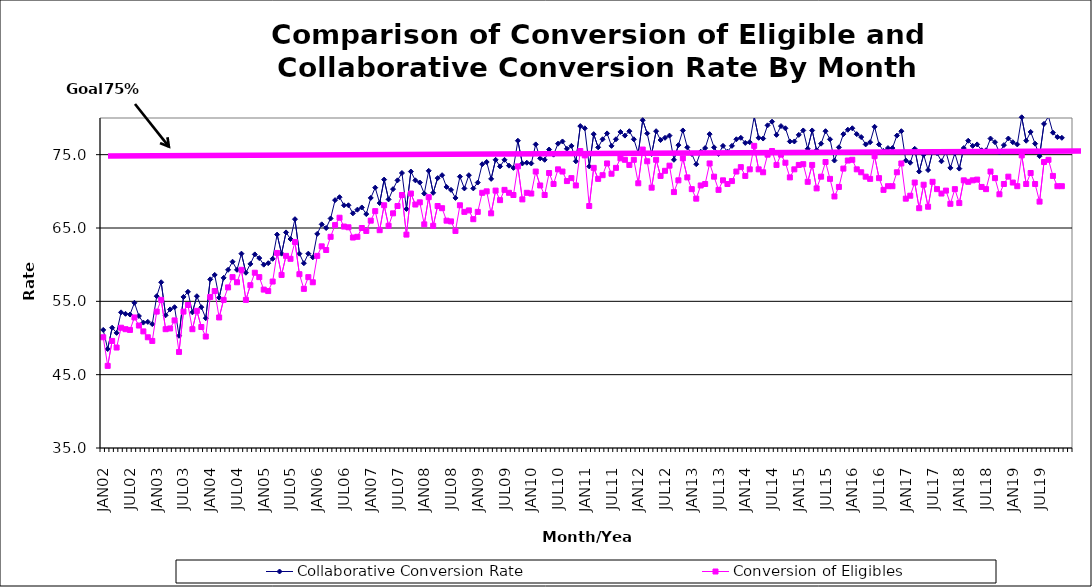
| Category | Collaborative Conversion Rate | Conversion of Eligibles |
|---|---|---|
| JAN02 | 51.1 | 50.1 |
| FEB02 | 48.5 | 46.2 |
| MAR02 | 51.4 | 49.6 |
| APR02 | 50.7 | 48.7 |
| MAY02 | 53.5 | 51.4 |
| JUN02 | 53.3 | 51.2 |
| JUL02 | 53.2 | 51.1 |
| AUG02 | 54.8 | 52.8 |
| SEP02 | 53 | 51.7 |
| OCT02 | 52.1 | 50.9 |
| NOV02 | 52.2 | 50.1 |
| DEC02 | 51.9 | 49.6 |
| JAN03 | 55.7 | 53.6 |
| FEB03 | 57.6 | 55.2 |
| MAR03 | 53.1 | 51.2 |
| APR03 | 53.9 | 51.3 |
| MAY03 | 54.2 | 52.4 |
| JUN03 | 50.3 | 48.1 |
| JUL03 | 55.6 | 53.6 |
| AUG03 | 56.3 | 54.5 |
| SEP03 | 53.5 | 51.2 |
| OCT03 | 55.7 | 53.7 |
| NOV03 | 54.2 | 51.5 |
| DEC03 | 52.7 | 50.2 |
| JAN04 | 58 | 55.6 |
| FEB04 | 58.6 | 56.4 |
| MAR04 | 55.5 | 52.8 |
| APR04 | 58.2 | 55.2 |
| MAY04 | 59.3 | 56.9 |
| JUN04 | 60.4 | 58.3 |
| JUL04 | 59.3 | 57.6 |
| AUG04 | 61.5 | 59.3 |
| SEP04 | 58.9 | 55.2 |
| OCT04 | 60.1 | 57.2 |
| NOV04 | 61.4 | 58.9 |
| DEC04 | 60.9 | 58.3 |
| JAN05 | 60 | 56.6 |
| FEB05 | 60.2 | 56.4 |
| MAR05 | 60.8 | 57.7 |
| APR05 | 64.1 | 61.6 |
| MAY05 | 61.5 | 58.6 |
| JUN05 | 64.4 | 61.2 |
| JUL05 | 63.5 | 60.8 |
| AUG05 | 66.2 | 63.1 |
| SEP05 | 61.5 | 58.7 |
| OCT05 | 60.2 | 56.7 |
| NOV05 | 61.5 | 58.3 |
| DEC05 | 61 | 57.6 |
| JAN06 | 64.2 | 61.2 |
| FEB06 | 65.5 | 62.5 |
| MAR06 | 65 | 62 |
| APR06 | 66.3 | 63.8 |
| MAY06 | 68.8 | 65.4 |
| JUN06 | 69.2 | 66.4 |
| JUL06 | 68.1 | 65.2 |
| AUG06 | 68.1 | 65.1 |
| SEP06 | 67 | 63.7 |
| OCT06 | 67.5 | 63.8 |
| NOV06 | 67.8 | 65 |
| DEC06 | 66.9 | 64.6 |
| JAN07 | 69.1 | 66 |
| FEB07 | 70.5 | 67.3 |
| MAR07 | 68.4 | 64.7 |
| APR07 | 71.6 | 68.1 |
| MAY07 | 68.9 | 65.3 |
| JUN07 | 70.3 | 67 |
| JUL07 | 71.5 | 68 |
| AUG07 | 72.5 | 69.5 |
| SEP07 | 67.6 | 64.1 |
| OCT07 | 72.7 | 69.7 |
| NOV07 | 71.5 | 68.2 |
| DEC07 | 71.2 | 68.5 |
| JAN08 | 69.7 | 65.5 |
| FEB08 | 72.8 | 69.2 |
| MAR08 | 69.8 | 65.3 |
| APR08 | 71.8 | 68 |
| MAY08 | 72.2 | 67.7 |
| JUN08 | 70.6 | 66 |
| JUL08 | 70.2 | 65.9 |
| AUG08 | 69.1 | 64.6 |
| SEP08 | 72 | 68.1 |
| OCT08 | 70.4 | 67.2 |
| NOV08 | 72.2 | 67.4 |
| DEC08 | 70.4 | 66.2 |
| JAN09 | 71.2 | 67.2 |
| FEB09 | 73.7 | 69.8 |
| MAR09 | 74 | 70 |
| APR09 | 71.7 | 67 |
| MAY09 | 74.3 | 70.1 |
| JUN09 | 73.4 | 68.8 |
| JUL09 | 74.3 | 70.2 |
| AUG09 | 73.5 | 69.8 |
| SEP09 | 73.2 | 69.5 |
| OCT09 | 76.9 | 73.4 |
| NOV09 | 73.8 | 68.9 |
| DEC09 | 73.9 | 69.8 |
| JAN10 | 73.8 | 69.7 |
| FEB10 | 76.4 | 72.7 |
| MAR10 | 74.5 | 70.8 |
| APR10 | 74.3 | 69.5 |
| MAY10 | 75.7 | 72.5 |
| JUN10 | 75 | 71 |
| JUL10 | 76.5 | 73 |
| AUG10 | 76.8 | 72.7 |
| SEP10 | 75.8 | 71.4 |
| OCT10 | 76.2 | 71.8 |
| NOV10 | 74.1 | 70.8 |
| DEC10 | 78.9 | 75.5 |
| JAN11 | 78.6 | 74.9 |
| FEB11 | 73.4 | 68 |
| MAR11 | 77.8 | 73.2 |
| APR11 | 76 | 71.7 |
| MAY11 | 77.1 | 72.2 |
| JUN11 | 77.9 | 73.8 |
| JUL11 | 76.2 | 72.4 |
| AUG11 | 77.1 | 73.2 |
| SEP11 | 78.1 | 74.5 |
| OCT11 | 77.6 | 74.3 |
| NOV11 | 78.2 | 73.6 |
| DEC11 | 77.1 | 74.3 |
| JAN12 | 75.2 | 71.1 |
| FEB12 | 79.7 | 75.7 |
| MAR12 | 77.9 | 74.1 |
| APR12 | 75.1 | 70.5 |
| MAY12 | 78.2 | 74.3 |
| JUN12 | 77 | 72.1 |
| JUL12 | 77.3 | 72.8 |
| AUG12 | 77.6 | 73.5 |
| SEP12 | 74.3 | 69.9 |
| OCT12 | 76.3 | 71.5 |
| NOV12 | 78.3 | 74.5 |
| DEC12 | 76 | 71.9 |
| JAN13 | 75.1 | 70.3 |
| FEB13 | 73.7 | 69 |
| MAR13 | 75.4 | 70.8 |
| APR13 | 75.9 | 71 |
| MAY13 | 77.8 | 73.8 |
| JUN13 | 76 | 72 |
| JUL13 | 75.1 | 70.2 |
| AUG13 | 76.2 | 71.5 |
| SEP13 | 75.4 | 71 |
| OCT13 | 76.2 | 71.4 |
| NOV13 | 77.1 | 72.7 |
| DEC13 | 77.3 | 73.3 |
| JAN14 | 76.6 | 72.1 |
| FEB14 | 76.7 | 73 |
| MAR14 | 80.2 | 76.2 |
| APR14 | 77.3 | 73 |
| MAY14 | 77.2 | 72.6 |
| JUN14 | 79 | 75 |
| JUL14 | 79.5 | 75.5 |
| AUG14 | 77.7 | 73.6 |
| SEP14 | 78.9 | 75 |
| OCT14 | 78.6 | 73.9 |
| NOV14 | 76.8 | 71.9 |
| DEC14 | 76.8 | 73 |
| JAN15 | 77.7 | 73.6 |
| FEB15 | 78.3 | 73.7 |
| MAR15 | 75.8 | 71.3 |
| APR15 | 78.3 | 73.6 |
| MAY15 | 75.6 | 70.4 |
| JUN15 | 76.5 | 72 |
| JUL15 | 78.2 | 74 |
| AUG15 | 77.1 | 71.7 |
| SEP15 | 74.2 | 69.3 |
| OCT15 | 76 | 70.6 |
| NOV15 | 77.8 | 73.1 |
| DEC15 | 78.4 | 74.2 |
| JAN16 | 78.6 | 74.3 |
| FEB16 | 77.8 | 73 |
| MAR16 | 77.4 | 72.6 |
| APR16 | 76.4 | 72 |
| MAY16 | 76.7 | 71.7 |
| JUN16 | 78.8 | 74.8 |
| JUL16 | 76.4 | 71.8 |
| AUG16 | 75.5 | 70.2 |
| SEP16 | 75.9 | 70.7 |
| OCT16 | 75.9 | 70.7 |
| NOV16 | 77.6 | 72.6 |
| DEC16 | 78.2 | 73.8 |
| JAN17 | 74.2 | 69 |
| FEB17 | 73.9 | 69.4 |
| MAR17 | 75.8 | 71.2 |
| APR17 | 72.7 | 67.7 |
| MAY17 | 75 | 70.9 |
| JUN17 | 72.9 | 67.9 |
| JUL17 | 75.4 | 71.3 |
| AUG17 | 75.2 | 70.3 |
| SEP17 | 74.1 | 69.7 |
| OCT17 | 75.4 | 70.1 |
| NOV17 | 73.2 | 68.3 |
| DEC17 | 75.2 | 70.3 |
| JAN18 | 73.1 | 68.4 |
| FEB18 | 75.9 | 71.5 |
| MAR18 | 76.9 | 71.3 |
| APR18 | 76.2 | 71.5 |
| MAY18 | 76.4 | 71.6 |
| JUN18 | 75.6 | 70.6 |
| JUL18 | 75.6 | 70.3 |
| AUG18 | 77.2 | 72.7 |
| SEP18 | 76.7 | 71.8 |
| OCT18 | 75.3 | 69.6 |
| NOV18 | 76.3 | 71 |
| DEC18 | 77.2 | 72 |
| JAN19 | 76.7 | 71.2 |
| FEB19 | 76.4 | 70.7 |
| MAR19 | 80.1 | 74.9 |
| APR19 | 76.9 | 71 |
| MAY19 | 78.1 | 72.5 |
| JUN19 | 76.5 | 71 |
| JUL19 | 74.8 | 68.6 |
| AUG19 | 79.2 | 74 |
| SEP19 | 80.2 | 74.3 |
| OCT19 | 78 | 72.1 |
| NOV19 | 77.4 | 70.7 |
| DEC19 | 77.3 | 70.7 |